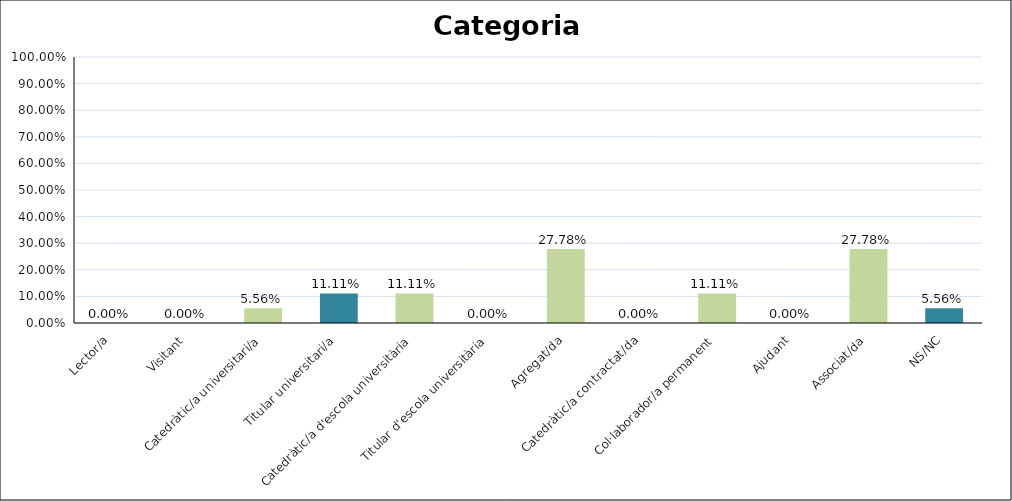
| Category | Series 0 |
|---|---|
| Lector/a | 0 |
| Visitant | 0 |
| Catedràtic/a universitari/a | 0.056 |
| Titular universitari/a | 0.111 |
| Catedràtic/a d'escola universitària | 0.111 |
| Titular d'escola universitària | 0 |
| Agregat/da | 0.278 |
| Catedràtic/a contractat/da | 0 |
| Col·laborador/a permanent | 0.111 |
| Ajudant | 0 |
| Associat/da | 0.278 |
| NS/NC | 0.056 |